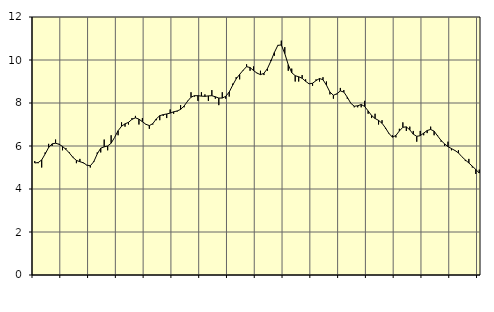
| Category | Piggar | Series 1 |
|---|---|---|
| nan | 5.3 | 5.21 |
| 87.0 | 5.2 | 5.23 |
| 87.0 | 5 | 5.35 |
| 87.0 | 5.7 | 5.63 |
| nan | 6.1 | 5.93 |
| 88.0 | 6 | 6.1 |
| 88.0 | 6.3 | 6.13 |
| 88.0 | 6.1 | 6.08 |
| nan | 5.8 | 5.98 |
| 89.0 | 5.9 | 5.84 |
| 89.0 | 5.7 | 5.67 |
| 89.0 | 5.5 | 5.47 |
| nan | 5.2 | 5.33 |
| 90.0 | 5.4 | 5.27 |
| 90.0 | 5.2 | 5.22 |
| 90.0 | 5.1 | 5.11 |
| nan | 5 | 5.08 |
| 91.0 | 5.3 | 5.27 |
| 91.0 | 5.7 | 5.63 |
| 91.0 | 5.7 | 5.9 |
| nan | 6.3 | 5.96 |
| 92.0 | 5.8 | 6 |
| 92.0 | 6.5 | 6.13 |
| 92.0 | 6.4 | 6.4 |
| nan | 6.5 | 6.71 |
| 93.0 | 7.1 | 6.92 |
| 93.0 | 6.9 | 7.03 |
| 93.0 | 7 | 7.1 |
| nan | 7.3 | 7.24 |
| 94.0 | 7.4 | 7.31 |
| 94.0 | 7 | 7.25 |
| 94.0 | 7.3 | 7.13 |
| nan | 7 | 7.01 |
| 95.0 | 6.8 | 6.95 |
| 95.0 | 7 | 7.04 |
| 95.0 | 7.2 | 7.26 |
| nan | 7.2 | 7.41 |
| 96.0 | 7.4 | 7.46 |
| 96.0 | 7.3 | 7.49 |
| 96.0 | 7.7 | 7.53 |
| nan | 7.5 | 7.59 |
| 97.0 | 7.6 | 7.63 |
| 97.0 | 7.9 | 7.7 |
| 97.0 | 7.8 | 7.86 |
| nan | 8.1 | 8.08 |
| 98.0 | 8.5 | 8.27 |
| 98.0 | 8.3 | 8.34 |
| 98.0 | 8.1 | 8.34 |
| nan | 8.5 | 8.32 |
| 99.0 | 8.4 | 8.31 |
| 99.0 | 8.1 | 8.33 |
| 99.0 | 8.6 | 8.34 |
| nan | 8.2 | 8.29 |
| 0.0 | 7.9 | 8.23 |
| 0.0 | 8.5 | 8.23 |
| 0.0 | 8.2 | 8.31 |
| nan | 8.3 | 8.51 |
| 1.0 | 8.9 | 8.83 |
| 1.0 | 9.2 | 9.12 |
| 1.0 | 9.1 | 9.33 |
| nan | 9.5 | 9.52 |
| 2.0 | 9.8 | 9.69 |
| 2.0 | 9.5 | 9.65 |
| 2.0 | 9.7 | 9.51 |
| nan | 9.4 | 9.39 |
| 3.0 | 9.5 | 9.32 |
| 3.0 | 9.3 | 9.38 |
| 3.0 | 9.5 | 9.6 |
| nan | 10 | 9.95 |
| 4.0 | 10.2 | 10.35 |
| 4.0 | 10.7 | 10.68 |
| 4.0 | 10.9 | 10.7 |
| nan | 10.6 | 10.3 |
| 5.0 | 9.5 | 9.78 |
| 5.0 | 9.6 | 9.41 |
| 5.0 | 9 | 9.27 |
| nan | 9 | 9.22 |
| 6.0 | 9.3 | 9.15 |
| 6.0 | 9.1 | 9.01 |
| 6.0 | 8.9 | 8.89 |
| nan | 8.8 | 8.92 |
| 7.0 | 9.1 | 9.04 |
| 7.0 | 9 | 9.14 |
| 7.0 | 9.2 | 9.08 |
| nan | 9 | 8.83 |
| 8.0 | 8.4 | 8.51 |
| 8.0 | 8.2 | 8.36 |
| 8.0 | 8.4 | 8.43 |
| nan | 8.7 | 8.56 |
| 9.0 | 8.6 | 8.51 |
| 9.0 | 8.2 | 8.27 |
| 9.0 | 8 | 7.99 |
| nan | 7.8 | 7.85 |
| 10.0 | 7.8 | 7.87 |
| 10.0 | 7.8 | 7.93 |
| 10.0 | 8.1 | 7.84 |
| nan | 7.5 | 7.63 |
| 11.0 | 7.3 | 7.42 |
| 11.0 | 7.5 | 7.28 |
| 11.0 | 7 | 7.19 |
| nan | 7.2 | 7.06 |
| 12.0 | 6.8 | 6.84 |
| 12.0 | 6.6 | 6.58 |
| 12.0 | 6.5 | 6.41 |
| nan | 6.4 | 6.49 |
| 13.0 | 6.8 | 6.7 |
| 13.0 | 7.1 | 6.87 |
| 13.0 | 6.7 | 6.89 |
| nan | 6.9 | 6.75 |
| 14.0 | 6.7 | 6.55 |
| 14.0 | 6.2 | 6.45 |
| 14.0 | 6.7 | 6.48 |
| nan | 6.5 | 6.6 |
| 15.0 | 6.6 | 6.72 |
| 15.0 | 6.9 | 6.77 |
| 15.0 | 6.5 | 6.69 |
| nan | 6.5 | 6.47 |
| 16.0 | 6.2 | 6.26 |
| 16.0 | 6 | 6.1 |
| 16.0 | 6.2 | 5.97 |
| nan | 5.8 | 5.88 |
| 17.0 | 5.8 | 5.79 |
| 17.0 | 5.8 | 5.68 |
| 17.0 | 5.5 | 5.5 |
| nan | 5.3 | 5.35 |
| 18.0 | 5.4 | 5.21 |
| 18.0 | 5 | 5.06 |
| 18.0 | 4.7 | 4.91 |
| nan | 4.9 | 4.74 |